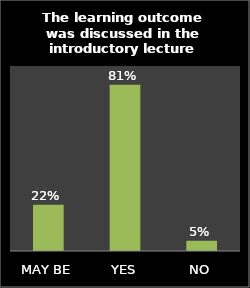
| Category | Series 0 |
|---|---|
| MAY BE | 0.225 |
| YES | 0.809 |
| NO | 0.05 |